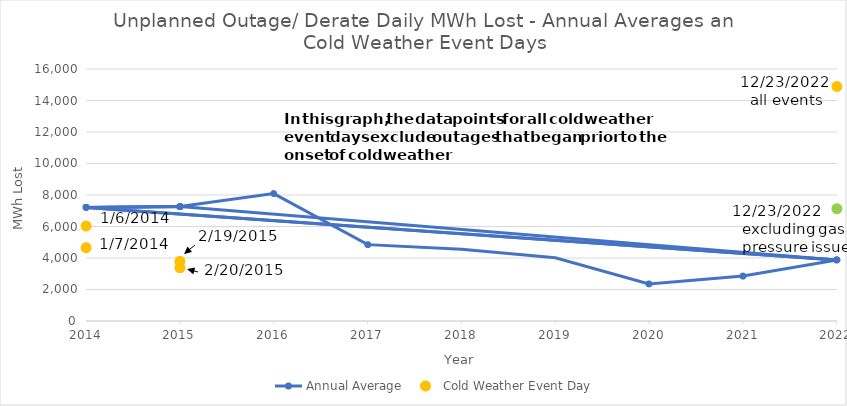
| Category | Annual Average |
|---|---|
| 2014-01-01 | 7211.229 |
| 2015-01-01 | 7268.612 |
| 2016-01-01 | 8090.489 |
| 2017-01-01 | 4848.945 |
| 2018-01-01 | 4551.095 |
| 2019-01-01 | 4010.112 |
| 2020-01-01 | 2353.87 |
| 2021-01-01 | 2851.676 |
| 2022-01-01 | 3878.338 |
| 2014-01-01 | 7211.229 |
| 2014-01-01 | 7211.229 |
| 2015-01-01 | 7268.612 |
| 2015-01-01 | 7268.612 |
| 2022-01-01 | 3878.338 |
| 2022-01-01 | 3878.338 |